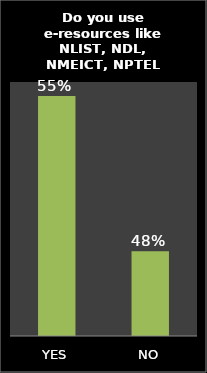
| Category | Series 0 |
|---|---|
| YES | 0.553 |
| NO | 0.48 |